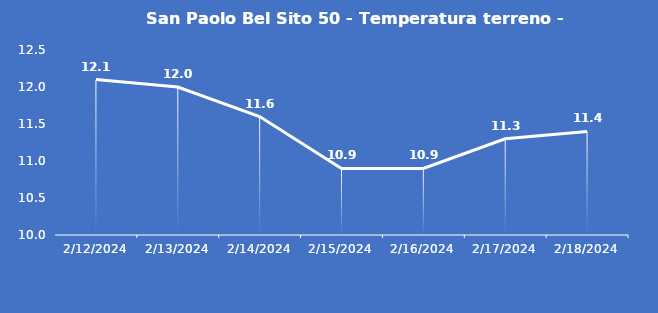
| Category | San Paolo Bel Sito 50 - Temperatura terreno - Grezzo (°C) |
|---|---|
| 2/12/24 | 12.1 |
| 2/13/24 | 12 |
| 2/14/24 | 11.6 |
| 2/15/24 | 10.9 |
| 2/16/24 | 10.9 |
| 2/17/24 | 11.3 |
| 2/18/24 | 11.4 |